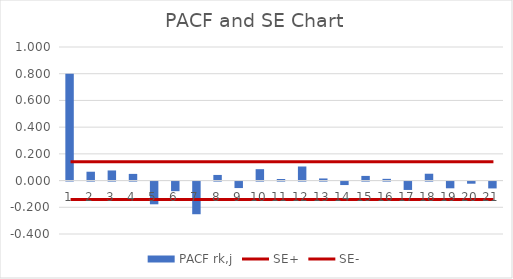
| Category | PACF rk,j |
|---|---|
| 0 | 0.8 |
| 1 | 0.066 |
| 2 | 0.076 |
| 3 | 0.05 |
| 4 | -0.17 |
| 5 | -0.072 |
| 6 | -0.245 |
| 7 | 0.042 |
| 8 | -0.049 |
| 9 | 0.085 |
| 10 | 0.012 |
| 11 | 0.105 |
| 12 | 0.016 |
| 13 | -0.026 |
| 14 | 0.035 |
| 15 | 0.013 |
| 16 | -0.063 |
| 17 | 0.051 |
| 18 | -0.05 |
| 19 | -0.016 |
| 20 | -0.051 |